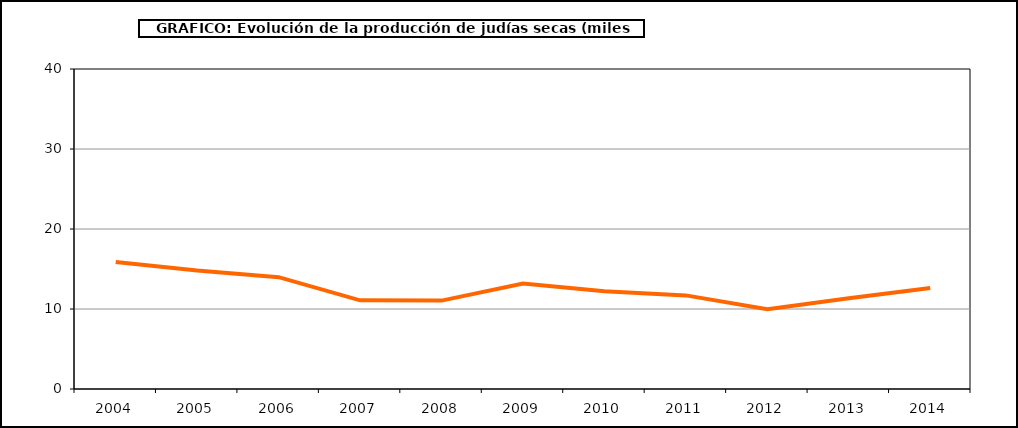
| Category | Superficie |
|---|---|
| 2004.0 | 15.888 |
| 2005.0 | 14.815 |
| 2006.0 | 13.983 |
| 2007.0 | 11.085 |
| 2008.0 | 11.048 |
| 2009.0 | 13.175 |
| 2010.0 | 12.226 |
| 2011.0 | 11.701 |
| 2012.0 | 9.971 |
| 2013.0 | 11.337 |
| 2014.0 | 12.629 |